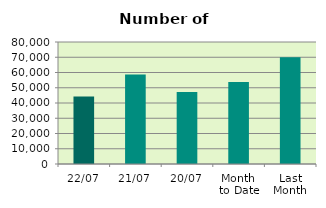
| Category | Series 0 |
|---|---|
| 22/07 | 44286 |
| 21/07 | 58734 |
| 20/07 | 47218 |
| Month 
to Date | 53715.75 |
| Last
Month | 70062.455 |